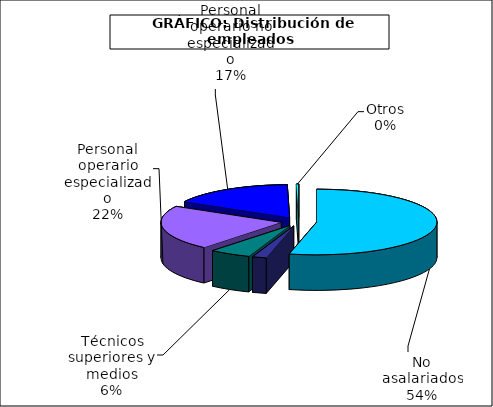
| Category | Series 0 |
|---|---|
| No asalariados | 9977.618 |
| Administrativos | 350.593 |
| Técnicos superiores y medios | 1033.848 |
| Personal operario especializado | 4080.011 |
| Personal operario no especializado | 3087.415 |
| Otros | 57.426 |